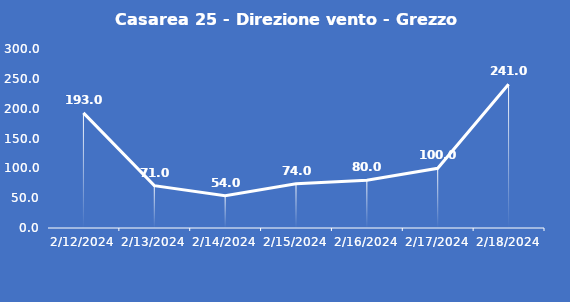
| Category | Casarea 25 - Direzione vento - Grezzo (°N) |
|---|---|
| 2/12/24 | 193 |
| 2/13/24 | 71 |
| 2/14/24 | 54 |
| 2/15/24 | 74 |
| 2/16/24 | 80 |
| 2/17/24 | 100 |
| 2/18/24 | 241 |